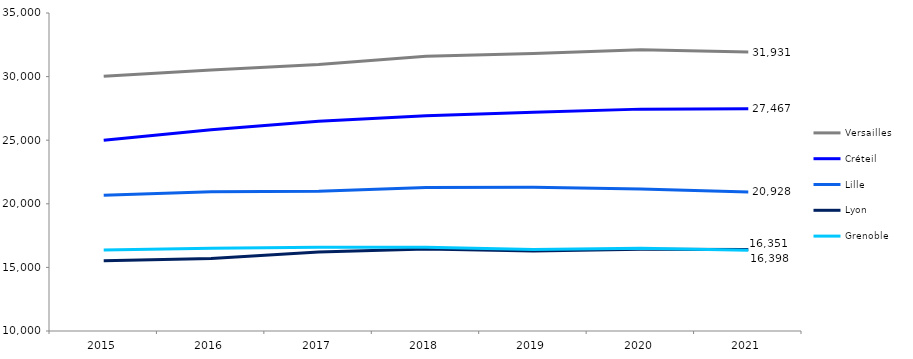
| Category | Versailles | Créteil | Lille | Lyon | Grenoble |
|---|---|---|---|---|---|
| 2015.0 | 30030 | 24992 | 20671 | 15515 | 16371 |
| 2016.0 | 30523 | 25816 | 20954 | 15708 | 16510 |
| 2017.0 | 30957 | 26483 | 20983 | 16202 | 16582 |
| 2018.0 | 31602 | 26922 | 21277 | 16451 | 16593 |
| 2019.0 | 31809 | 27206 | 21299 | 16288 | 16410 |
| 2020.0 | 32118 | 27443 | 21166 | 16433 | 16514 |
| 2021.0 | 31931 | 27467 | 20928 | 16398 | 16351 |